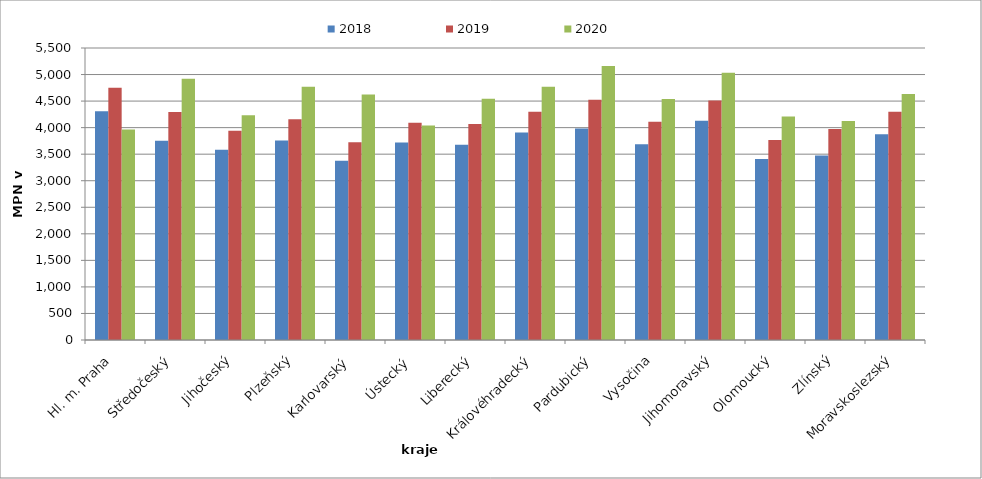
| Category | 2018 | 2019 | 2020 |
|---|---|---|---|
| Hl. m. Praha | 4308 | 4749 | 3966 |
| Středočeský | 3752 | 4294 | 4919 |
| Jihočeský | 3583 | 3942 | 4234 |
| Plzeňský | 3759 | 4160 | 4769 |
| Karlovarský  | 3377 | 3725 | 4626 |
| Ústecký   | 3718 | 4090 | 4040 |
| Liberecký | 3676 | 4067 | 4546 |
| Královéhradecký | 3908 | 4299 | 4772 |
| Pardubický | 3986 | 4526 | 5159 |
| Vysočina | 3689 | 4113 | 4538 |
| Jihomoravský | 4132 | 4513 | 5033 |
| Olomoucký | 3407 | 3765 | 4210 |
| Zlínský | 3473 | 3974 | 4123 |
| Moravskoslezský | 3874 | 4301 | 4633 |